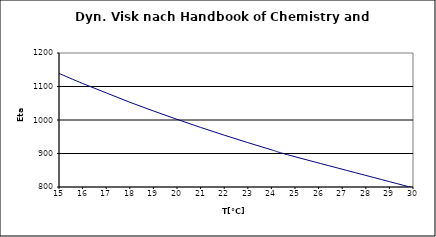
| Category | Series 0 |
|---|---|
| 15.0 | 1139 |
| 16.0 | 1109 |
| 17.0 | 1081 |
| 18.0 | 1053 |
| 19.0 | 1027 |
| 20.0 | 1002 |
| 21.0 | 977.9 |
| 22.0 | 954.8 |
| 23.0 | 932.5 |
| 24.0 | 911.1 |
| 25.0 | 890.4 |
| 30.0 | 797.5 |